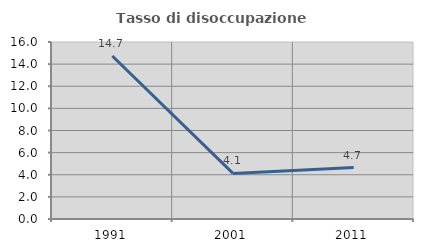
| Category | Tasso di disoccupazione giovanile  |
|---|---|
| 1991.0 | 14.737 |
| 2001.0 | 4.124 |
| 2011.0 | 4.651 |